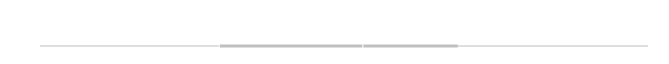
| Category | 75 Percentile | Median | 25 Percentile |
|---|---|---|---|
| 0 | 18 | 14 | 8 |